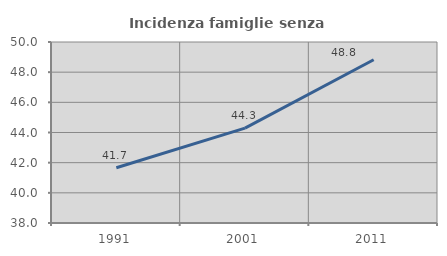
| Category | Incidenza famiglie senza nuclei |
|---|---|
| 1991.0 | 41.667 |
| 2001.0 | 44.289 |
| 2011.0 | 48.822 |